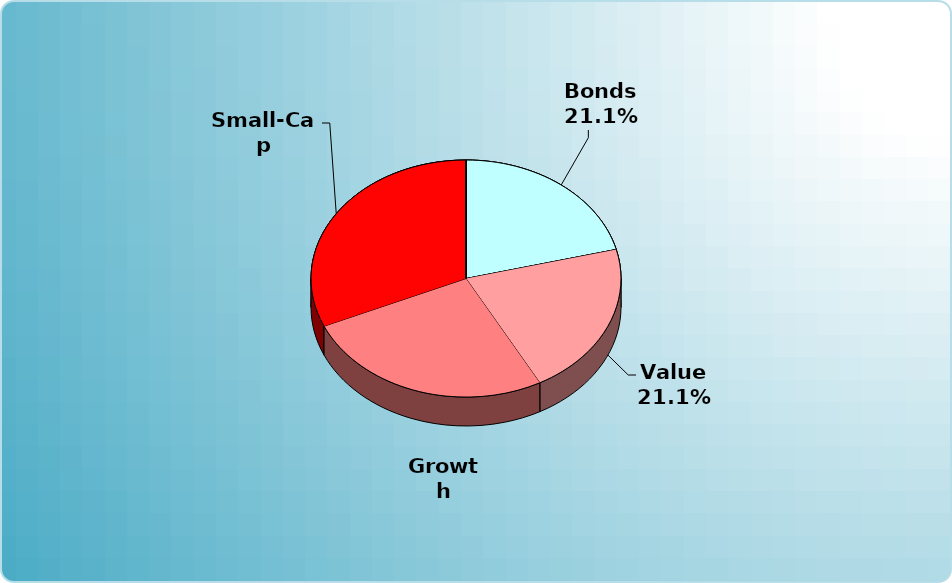
| Category | Series 0 |
|---|---|
| Cash | 0 |
| Bonds | 4000 |
| Muni Bond | 0 |
| Hybrid bond | 0 |
| Value | 4000 |
| Growth | 5000 |
| Small-Cap | 6000 |
| Tangibles | 0 |
| International | 0 |
| Personal Property | 0 |
| Miscellaneous | 0 |